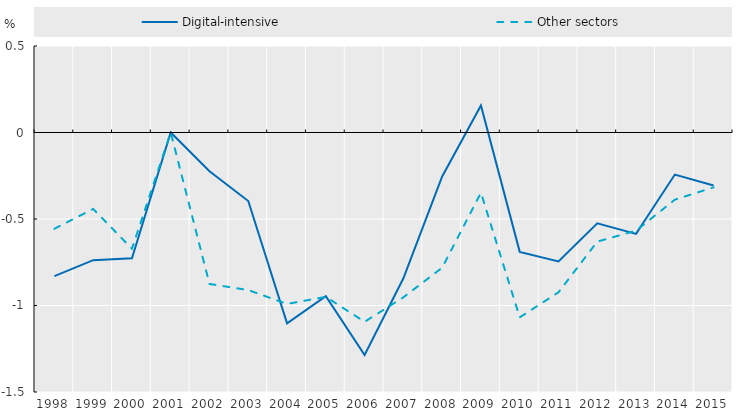
| Category | Digital-intensive | Other sectors |
|---|---|---|
| 1998.0 | -0.83 | -0.556 |
| 1999.0 | -0.738 | -0.442 |
| 2000.0 | -0.727 | -0.672 |
| 2001.0 | 0 | 0 |
| 2002.0 | -0.224 | -0.875 |
| 2003.0 | -0.396 | -0.911 |
| 2004.0 | -1.103 | -0.991 |
| 2005.0 | -0.946 | -0.95 |
| 2006.0 | -1.286 | -1.094 |
| 2007.0 | -0.843 | -0.953 |
| 2008.0 | -0.254 | -0.782 |
| 2009.0 | 0.156 | -0.348 |
| 2010.0 | -0.69 | -1.069 |
| 2011.0 | -0.746 | -0.924 |
| 2012.0 | -0.525 | -0.631 |
| 2013.0 | -0.586 | -0.568 |
| 2014.0 | -0.243 | -0.388 |
| 2015.0 | -0.306 | -0.317 |